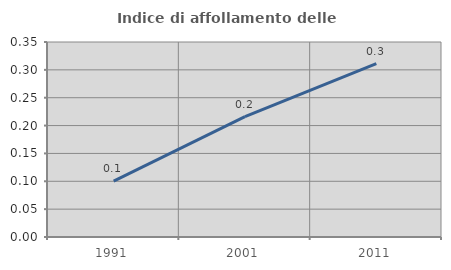
| Category | Indice di affollamento delle abitazioni  |
|---|---|
| 1991.0 | 0.1 |
| 2001.0 | 0.216 |
| 2011.0 | 0.311 |